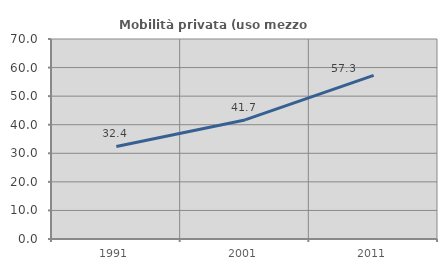
| Category | Mobilità privata (uso mezzo privato) |
|---|---|
| 1991.0 | 32.407 |
| 2001.0 | 41.667 |
| 2011.0 | 57.285 |